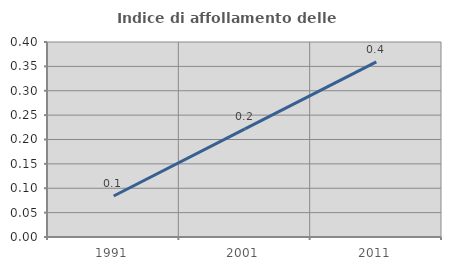
| Category | Indice di affollamento delle abitazioni  |
|---|---|
| 1991.0 | 0.084 |
| 2001.0 | 0.222 |
| 2011.0 | 0.359 |